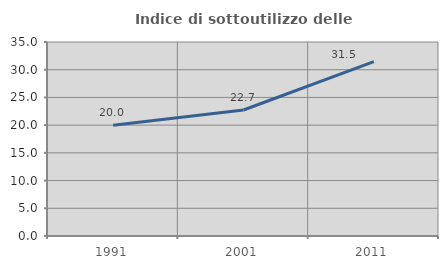
| Category | Indice di sottoutilizzo delle abitazioni  |
|---|---|
| 1991.0 | 20 |
| 2001.0 | 22.735 |
| 2011.0 | 31.467 |